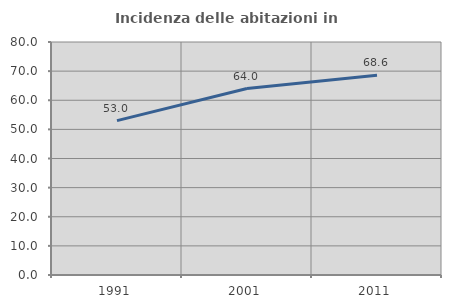
| Category | Incidenza delle abitazioni in proprietà  |
|---|---|
| 1991.0 | 53.017 |
| 2001.0 | 64.017 |
| 2011.0 | 68.566 |